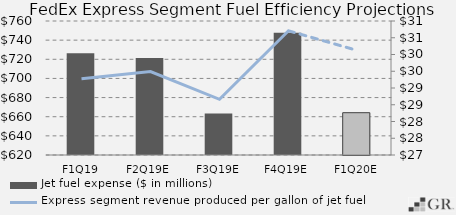
| Category | Jet fuel expense ($ in millions) |
|---|---|
|  F1Q19  | 726.404 |
|  F2Q19E  | 721.402 |
|  F3Q19E  | 663.239 |
|  F4Q19E  | 747.843 |
|  F1Q20E  | 664.205 |